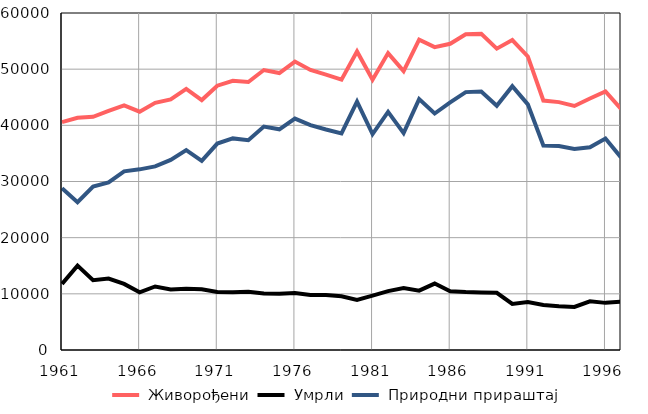
| Category |  Живорођени |  Умрли |  Природни прираштај |
|---|---|---|---|
| 1961.0 | 40561 | 11759 | 28802 |
| 1962.0 | 41336 | 15024 | 26312 |
| 1963.0 | 41525 | 12423 | 29102 |
| 1964.0 | 42557 | 12731 | 29826 |
| 1965.0 | 43569 | 11767 | 31802 |
| 1966.0 | 42429 | 10266 | 32163 |
| 1967.0 | 44001 | 11308 | 32693 |
| 1968.0 | 44627 | 10781 | 33846 |
| 1969.0 | 46480 | 10892 | 35588 |
| 1970.0 | 44496 | 10829 | 33667 |
| 1971.0 | 47060 | 10312 | 36748 |
| 1972.0 | 47943 | 10270 | 37673 |
| 1973.0 | 47714 | 10358 | 37356 |
| 1974.0 | 49847 | 10075 | 39772 |
| 1975.0 | 49310 | 10018 | 39292 |
| 1976.0 | 51355 | 10149 | 41206 |
| 1977.0 | 49849 | 9811 | 40038 |
| 1978.0 | 49027 | 9776 | 39251 |
| 1979.0 | 48125 | 9575 | 38550 |
| 1980.0 | 53147 | 8909 | 44238 |
| 1981.0 | 48111 | 9677 | 38434 |
| 1982.0 | 52865 | 10479 | 42386 |
| 1983.0 | 49645 | 11040 | 38605 |
| 1984.0 | 55243 | 10573 | 44670 |
| 1985.0 | 53925 | 11826 | 42099 |
| 1986.0 | 54519 | 10446 | 44073 |
| 1987.0 | 56221 | 10307 | 45914 |
| 1988.0 | 56283 | 10257 | 46026 |
| 1989.0 | 53656 | 10181 | 43475 |
| 1990.0 | 55175 | 8214 | 46961 |
| 1991.0 | 52263 | 8526 | 43737 |
| 1992.0 | 44418 | 8004 | 36414 |
| 1993.0 | 44132 | 7804 | 36328 |
| 1994.0 | 43450 | 7667 | 35783 |
| 1995.0 | 44776 | 8671 | 36105 |
| 1996.0 | 46041 | 8392 | 37649 |
| 1997.0 | 42920 | 8624 | 34296 |